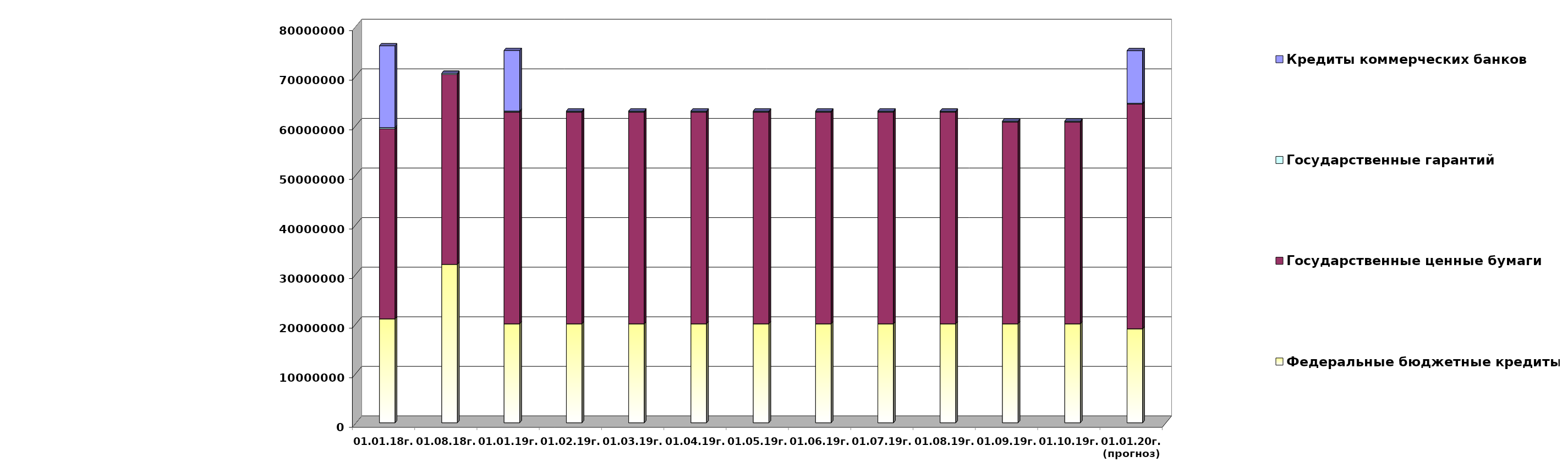
| Category | Федеральные бюджетные кредиты | Государственные ценные бумаги  | Государственные гарантий | Кредиты коммерческих банков |
|---|---|---|---|---|
| 01.01.18г. | 20959084.963 | 38300000 | 267412.82 | 16500000 |
| 01.08.18г. | 31945227.963 | 38300000 | 232477.01 | 0 |
| 01.01.19г. | 19957026.213 | 42700000 | 209872.86 | 12219963.75 |
| 01.02.19г. | 19957026.213 | 42700000 | 200735.86 | 0 |
| 01.03.19г. | 19957026.213 | 42700000 | 200735.86 | 0 |
| 01.04.19г. | 19957026.213 | 42700000 | 200735.86 | 0 |
| 01.05.19г. | 19957026.213 | 42700000 | 200735.86 | 0 |
| 01.06.19г. | 19957026.213 | 42700000 | 200735.86 | 0 |
| 01.07.19г. | 19957026.213 | 42700000 | 200735.86 | 0 |
| 01.08.19г. | 19957026.213 | 42700000 | 187793.375 | 0 |
| 01.09.19г. | 19957026.213 | 40700000 | 187793.375 | 0 |
| 01.10.19г. | 19957026.213 | 40700000 | 187793.375 | 0 |
| 01.01.20г.
(прогноз) | 18954967.4 | 45300000 | 176330 | 10616393.4 |